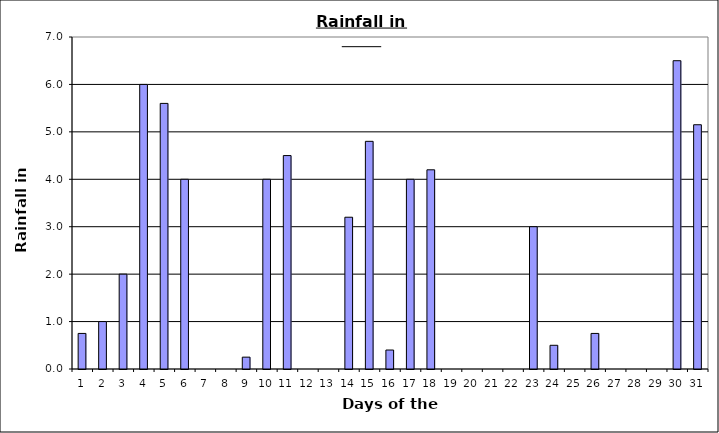
| Category | Series 0 |
|---|---|
| 0 | 0.75 |
| 1 | 1 |
| 2 | 2 |
| 3 | 6 |
| 4 | 5.6 |
| 5 | 4 |
| 6 | 0 |
| 7 | 0 |
| 8 | 0.25 |
| 9 | 4 |
| 10 | 4.5 |
| 11 | 0 |
| 12 | 0 |
| 13 | 3.2 |
| 14 | 4.8 |
| 15 | 0.4 |
| 16 | 4 |
| 17 | 4.2 |
| 18 | 0 |
| 19 | 0 |
| 20 | 0 |
| 21 | 0 |
| 22 | 3 |
| 23 | 0.5 |
| 24 | 0 |
| 25 | 0.75 |
| 26 | 0 |
| 27 | 0 |
| 28 | 0 |
| 29 | 6.5 |
| 30 | 5.15 |